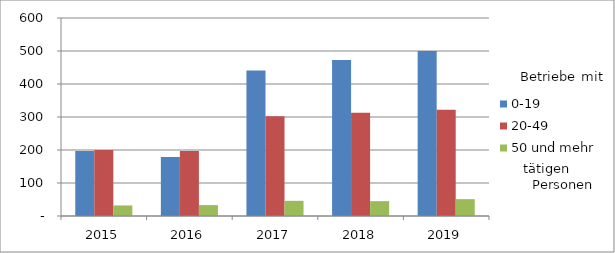
| Category | 0-19 | 20-49 | 50 und mehr |
|---|---|---|---|
| 2015.0 | 197 | 200 | 32 |
| 2016.0 | 179 | 197 | 33 |
| 2017.0 | 441 | 302 | 46 |
| 2018.0 | 473 | 313 | 45 |
| 2019.0 | 500 | 322 | 51 |